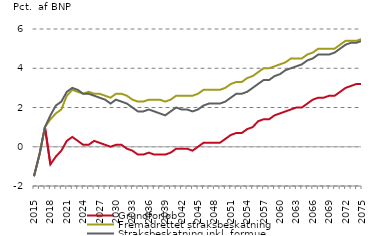
| Category | nul-linje | Grundforløb  | Fremadrettet straksbeskatning | Straksbeskatning inkl. formue |
|---|---|---|---|---|
| 2015.0 | 0 | -1.5 | -1.5 | -1.5 |
| 2016.0 | 0 | -0.4 | -0.4 | -0.4 |
| 2017.0 | 0 | 1 | 1 | 1 |
| 2018.0 | 0 | -0.9 | 1.4 | 1.6 |
| 2019.0 | 0 | -0.5 | 1.7 | 2.1 |
| 2020.0 | 0 | -0.2 | 1.9 | 2.3 |
| 2021.0 | 0 | 0.3 | 2.6 | 2.8 |
| 2022.0 | 0 | 0.5 | 2.9 | 3 |
| 2023.0 | 0 | 0.3 | 2.8 | 2.9 |
| 2024.0 | 0 | 0.1 | 2.7 | 2.7 |
| 2025.0 | 0 | 0.1 | 2.8 | 2.7 |
| 2026.0 | 0 | 0.3 | 2.7 | 2.6 |
| 2027.0 | 0 | 0.2 | 2.7 | 2.5 |
| 2028.0 | 0 | 0.1 | 2.6 | 2.4 |
| 2029.0 | 0 | 0 | 2.5 | 2.2 |
| 2030.0 | 0 | 0.1 | 2.7 | 2.4 |
| 2031.0 | 0 | 0.1 | 2.7 | 2.3 |
| 2032.0 | 0 | -0.1 | 2.6 | 2.2 |
| 2033.0 | 0 | -0.2 | 2.4 | 2 |
| 2034.0 | 0 | -0.4 | 2.3 | 1.8 |
| 2035.0 | 0 | -0.4 | 2.3 | 1.8 |
| 2036.0 | 0 | -0.3 | 2.4 | 1.9 |
| 2037.0 | 0 | -0.4 | 2.4 | 1.8 |
| 2038.0 | 0 | -0.4 | 2.4 | 1.7 |
| 2039.0 | 0 | -0.4 | 2.3 | 1.6 |
| 2040.0 | 0 | -0.3 | 2.4 | 1.8 |
| 2041.0 | 0 | -0.1 | 2.6 | 2 |
| 2042.0 | 0 | -0.1 | 2.6 | 1.9 |
| 2043.0 | 0 | -0.1 | 2.6 | 1.9 |
| 2044.0 | 0 | -0.2 | 2.6 | 1.8 |
| 2045.0 | 0 | 0 | 2.7 | 1.9 |
| 2046.0 | 0 | 0.2 | 2.9 | 2.1 |
| 2047.0 | 0 | 0.2 | 2.9 | 2.2 |
| 2048.0 | 0 | 0.2 | 2.9 | 2.2 |
| 2049.0 | 0 | 0.2 | 2.9 | 2.2 |
| 2050.0 | 0 | 0.4 | 3 | 2.3 |
| 2051.0 | 0 | 0.6 | 3.2 | 2.5 |
| 2052.0 | 0 | 0.7 | 3.3 | 2.7 |
| 2053.0 | 0 | 0.7 | 3.3 | 2.7 |
| 2054.0 | 0 | 0.9 | 3.5 | 2.8 |
| 2055.0 | 0 | 1 | 3.6 | 3 |
| 2056.0 | 0 | 1.3 | 3.8 | 3.2 |
| 2057.0 | 0 | 1.4 | 4 | 3.4 |
| 2058.0 | 0 | 1.4 | 4 | 3.4 |
| 2059.0 | 0 | 1.6 | 4.1 | 3.6 |
| 2060.0 | 0 | 1.7 | 4.2 | 3.7 |
| 2061.0 | 0 | 1.8 | 4.3 | 3.9 |
| 2062.0 | 0 | 1.9 | 4.5 | 4 |
| 2063.0 | 0 | 2 | 4.5 | 4.1 |
| 2064.0 | 0 | 2 | 4.5 | 4.2 |
| 2065.0 | 0 | 2.2 | 4.7 | 4.4 |
| 2066.0 | 0 | 2.4 | 4.8 | 4.5 |
| 2067.0 | 0 | 2.5 | 5 | 4.7 |
| 2068.0 | 0 | 2.5 | 5 | 4.7 |
| 2069.0 | 0 | 2.6 | 5 | 4.7 |
| 2070.0 | 0 | 2.6 | 5 | 4.8 |
| 2071.0 | 0 | 2.8 | 5.2 | 5 |
| 2072.0 | 0 | 3 | 5.4 | 5.2 |
| 2073.0 | 0 | 3.1 | 5.4 | 5.3 |
| 2074.0 | 0 | 3.2 | 5.4 | 5.3 |
| 2075.0 | 0 | 3.2 | 5.5 | 5.4 |